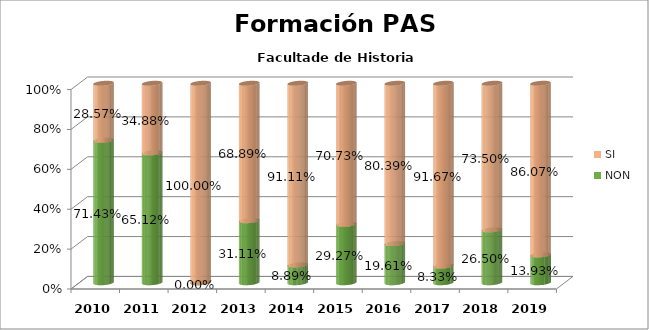
| Category | NON | SI |
|---|---|---|
| 2010.0 | 0.714 | 0.286 |
| 2011.0 | 0.651 | 0.349 |
| 2012.0 | 0 | 1 |
| 2013.0 | 0.311 | 0.689 |
| 2014.0 | 0.089 | 0.911 |
| 2015.0 | 0.293 | 0.707 |
| 2016.0 | 0.196 | 0.804 |
| 2017.0 | 0.083 | 0.917 |
| 2018.0 | 0.265 | 0.735 |
| 2019.0 | 0.139 | 0.861 |